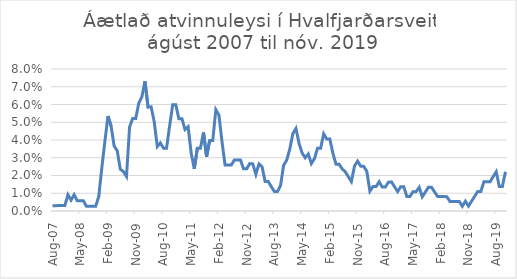
| Category | Áætlað atvinnuleysi |
|---|---|
| 2007-08-01 | 0.003 |
| 2007-09-01 | 0.003 |
| 2007-10-01 | 0.003 |
| 2007-11-01 | 0.003 |
| 2007-12-01 | 0.003 |
| 2008-01-01 | 0.009 |
| 2008-02-01 | 0.006 |
| 2008-03-01 | 0.009 |
| 2008-04-01 | 0.006 |
| 2008-05-01 | 0.006 |
| 2008-06-01 | 0.006 |
| 2008-07-01 | 0.003 |
| 2008-08-01 | 0.003 |
| 2008-09-01 | 0.003 |
| 2008-10-01 | 0.003 |
| 2008-11-01 | 0.008 |
| 2008-12-01 | 0.024 |
| 2009-01-01 | 0.039 |
| 2009-02-01 | 0.054 |
| 2009-03-01 | 0.048 |
| 2009-04-01 | 0.037 |
| 2009-05-01 | 0.034 |
| 2009-06-01 | 0.023 |
| 2009-07-01 | 0.022 |
| 2009-08-01 | 0.019 |
| 2009-09-01 | 0.047 |
| 2009-10-01 | 0.052 |
| 2009-11-01 | 0.052 |
| 2009-12-01 | 0.061 |
| 2010-01-01 | 0.064 |
| 2010-02-01 | 0.073 |
| 2010-03-01 | 0.058 |
| 2010-04-01 | 0.059 |
| 2010-05-01 | 0.05 |
| 2010-06-01 | 0.036 |
| 2010-07-01 | 0.038 |
| 2010-08-01 | 0.035 |
| 2010-09-01 | 0.035 |
| 2010-10-01 | 0.048 |
| 2010-11-01 | 0.06 |
| 2010-12-01 | 0.06 |
| 2011-01-01 | 0.052 |
| 2011-02-01 | 0.052 |
| 2011-03-01 | 0.046 |
| 2011-04-01 | 0.047 |
| 2011-05-01 | 0.033 |
| 2011-06-01 | 0.024 |
| 2011-07-01 | 0.035 |
| 2011-08-01 | 0.035 |
| 2011-09-01 | 0.044 |
| 2011-10-01 | 0.031 |
| 2011-11-01 | 0.04 |
| 2011-12-01 | 0.04 |
| 2012-01-01 | 0.057 |
| 2012-02-01 | 0.054 |
| 2012-03-01 | 0.039 |
| 2012-04-01 | 0.026 |
| 2012-05-01 | 0.026 |
| 2012-06-01 | 0.026 |
| 2012-07-01 | 0.029 |
| 2012-08-01 | 0.029 |
| 2012-09-01 | 0.029 |
| 2012-10-01 | 0.024 |
| 2012-11-01 | 0.024 |
| 2012-12-01 | 0.027 |
| 2013-01-01 | 0.027 |
| 2013-02-01 | 0.021 |
| 2013-03-01 | 0.027 |
| 2013-04-01 | 0.025 |
| 2013-05-01 | 0.017 |
| 2013-06-01 | 0.017 |
| 2013-07-01 | 0.014 |
| 2013-08-01 | 0.011 |
| 2013-09-01 | 0.011 |
| 2013-10-01 | 0.014 |
| 2013-11-01 | 0.026 |
| 2013-12-01 | 0.029 |
| 2014-01-01 | 0.035 |
| 2014-02-01 | 0.044 |
| 2014-03-01 | 0.047 |
| 2014-04-01 | 0.038 |
| 2014-05-01 | 0.033 |
| 2014-06-01 | 0.03 |
| 2014-07-01 | 0.032 |
| 2014-08-01 | 0.027 |
| 2014-09-01 | 0.029 |
| 2014-10-01 | 0.035 |
| 2014-11-01 | 0.035 |
| 2014-12-01 | 0.043 |
| 2015-01-01 | 0.041 |
| 2015-02-01 | 0.041 |
| 2015-03-01 | 0.032 |
| 2015-04-01 | 0.026 |
| 2015-05-01 | 0.026 |
| 2015-06-01 | 0.024 |
| 2015-07-01 | 0.022 |
| 2015-08-01 | 0.019 |
| 2015-09-01 | 0.017 |
| 2015-10-01 | 0.025 |
| 2015-11-01 | 0.028 |
| 2015-12-01 | 0.025 |
| 2016-01-01 | 0.025 |
| 2016-02-01 | 0.022 |
| 2016-03-01 | 0.011 |
| 2016-04-01 | 0.014 |
| 2016-05-01 | 0.014 |
| 2016-06-01 | 0.016 |
| 2016-07-01 | 0.013 |
| 2016-08-01 | 0.013 |
| 2016-09-01 | 0.016 |
| 2016-10-01 | 0.016 |
| 2016-11-01 | 0.014 |
| 2016-12-01 | 0.011 |
| 2017-01-01 | 0.014 |
| 2017-02-01 | 0.014 |
| 2017-03-01 | 0.008 |
| 2017-04-01 | 0.008 |
| 2017-05-01 | 0.011 |
| 2017-06-01 | 0.011 |
| 2017-07-01 | 0.013 |
| 2017-08-01 | 0.008 |
| 2017-09-01 | 0.011 |
| 2017-10-01 | 0.013 |
| 2017-11-01 | 0.013 |
| 2017-12-01 | 0.011 |
| 2018-01-01 | 0.008 |
| 2018-02-01 | 0.008 |
| 2018-03-01 | 0.008 |
| 2018-04-01 | 0.008 |
| 2018-05-01 | 0.005 |
| 2018-06-01 | 0.005 |
| 2018-07-01 | 0.005 |
| 2018-08-01 | 0.005 |
| 2018-09-01 | 0.003 |
| 2018-10-01 | 0.006 |
| 2018-11-01 | 0.003 |
| 2018-12-01 | 0.006 |
| 2019-01-01 | 0.008 |
| 2019-02-01 | 0.011 |
| 2019-03-01 | 0.011 |
| 2019-04-01 | 0.016 |
| 2019-05-01 | 0.016 |
| 2019-06-01 | 0.016 |
| 2019-07-01 | 0.019 |
| 2019-08-01 | 0.022 |
| 2019-09-01 | 0.014 |
| 2019-10-01 | 0.014 |
| 2019-11-01 | 0.022 |